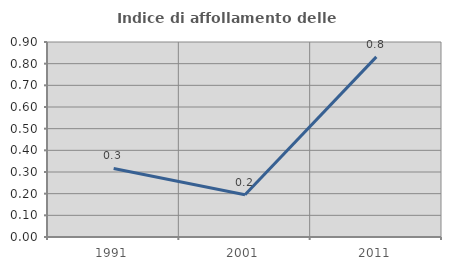
| Category | Indice di affollamento delle abitazioni  |
|---|---|
| 1991.0 | 0.317 |
| 2001.0 | 0.195 |
| 2011.0 | 0.831 |